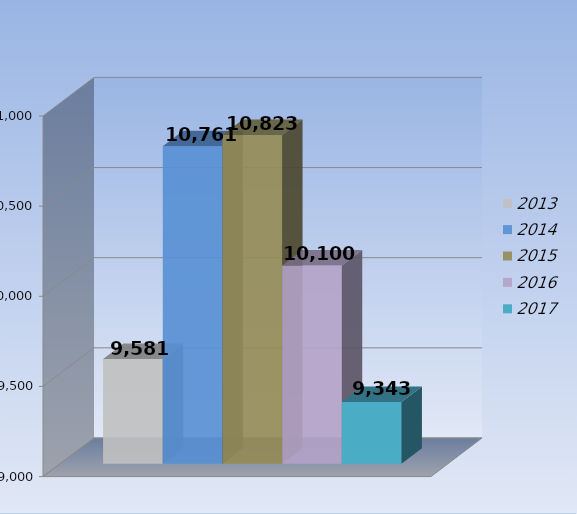
| Category | 2013 | 2014 | 2015 | 2016 | 2017 |
|---|---|---|---|---|---|
| 0 | 9581 | 10761 | 10823 | 10100 | 9343 |